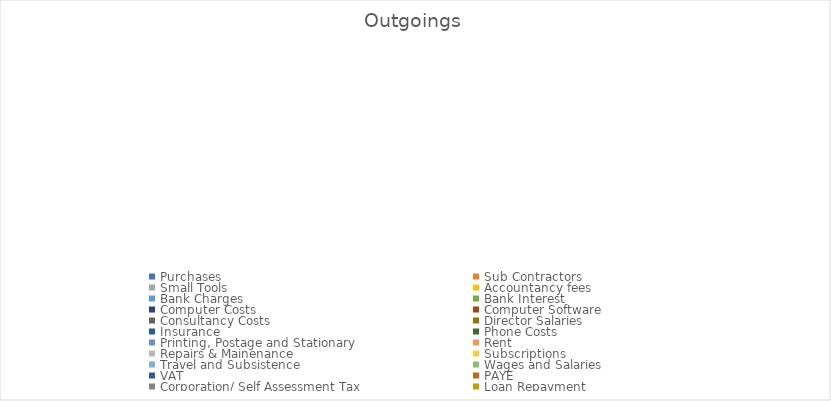
| Category | Series 0 | Series 1 | Series 2 | Series 3 | Series 4 | Series 5 |
|---|---|---|---|---|---|---|
| Purchases | 0 |  |  |  |  |  |
| Sub Contractors | 0 |  |  |  |  |  |
| Small Tools | 0 |  |  |  |  |  |
| Accountancy fees | 0 |  |  |  |  |  |
| Bank Charges | 0 |  |  |  |  |  |
| Bank Interest | 0 |  |  |  |  |  |
| Computer Costs | 0 |  |  |  |  |  |
| Computer Software | 0 |  |  |  |  |  |
| Consultancy Costs | 0 |  |  |  |  |  |
| Director Salaries | 0 |  |  |  |  |  |
| Insurance | 0 |  |  |  |  |  |
| Phone Costs | 0 |  |  |  |  |  |
| Printing, Postage and Stationary | 0 |  |  |  |  |  |
| Rent | 0 |  |  |  |  |  |
| Repairs & Mainenance | 0 |  |  |  |  |  |
| Subscriptions | 0 |  |  |  |  |  |
| Travel and Subsistence | 0 |  |  |  |  |  |
| Wages and Salaries | 0 |  |  |  |  |  |
| VAT | 0 |  |  |  |  |  |
| PAYE | 0 |  |  |  |  |  |
| Corporation/ Self Assessment Tax | 0 |  |  |  |  |  |
| Loan Repayment | 0 |  |  |  |  |  |